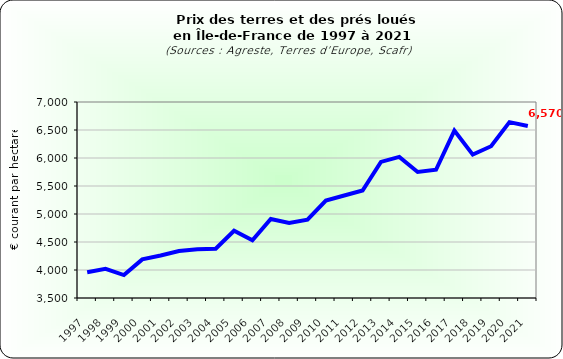
| Category | Series 1 |
|---|---|
| 1997.0 | 3960 |
| 1998.0 | 4020 |
| 1999.0 | 3910 |
| 2000.0 | 4190 |
| 2001.0 | 4260 |
| 2002.0 | 4340 |
| 2003.0 | 4370 |
| 2004.0 | 4380 |
| 2005.0 | 4700 |
| 2006.0 | 4530 |
| 2007.0 | 4910 |
| 2008.0 | 4840 |
| 2009.0 | 4900 |
| 2010.0 | 5240 |
| 2011.0 | 5330 |
| 2012.0 | 5420 |
| 2013.0 | 5930 |
| 2014.0 | 6020 |
| 2015.0 | 5750 |
| 2016.0 | 5790 |
| 2017.0 | 6490 |
| 2018.0 | 6060 |
| 2019.0 | 6210 |
| 2020.0 | 6640 |
| 2021.0 | 6570 |